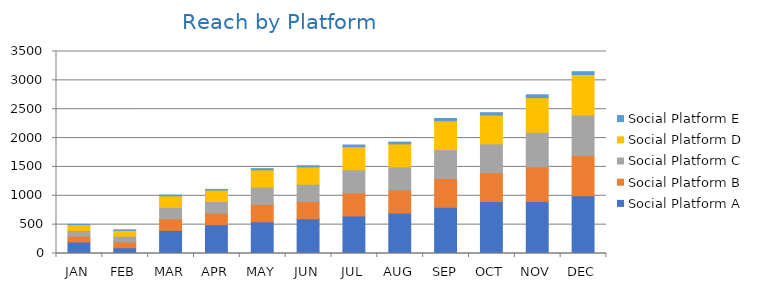
| Category | Social Platform A | Social Platform B | Social Platform C | Social Platform D | Social Platform E |
|---|---|---|---|---|---|
| JAN | 200 | 100 | 100 | 100 | 5 |
| FEB | 100 | 100 | 100 | 100 | 10 |
| MAR | 400 | 200 | 200 | 200 | 12 |
| APR | 500 | 200 | 200 | 200 | 10 |
| MAY | 550 | 300 | 300 | 300 | 20 |
| JUN | 600 | 300 | 300 | 300 | 20 |
| JUL | 650 | 400 | 400 | 400 | 30 |
| AUG | 700 | 400 | 400 | 400 | 30 |
| SEP | 800 | 500 | 500 | 500 | 40 |
| OCT | 900 | 500 | 500 | 500 | 40 |
| NOV | 900 | 600 | 600 | 600 | 50 |
| DEC | 1000 | 700 | 700 | 700 | 50 |